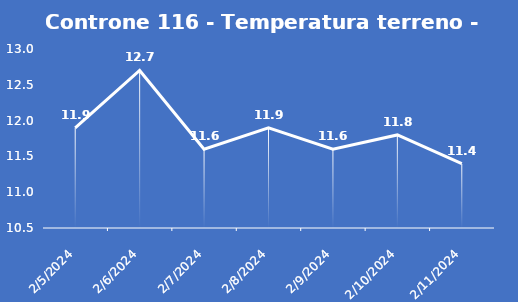
| Category | Controne 116 - Temperatura terreno - Grezzo (°C) |
|---|---|
| 2/5/24 | 11.9 |
| 2/6/24 | 12.7 |
| 2/7/24 | 11.6 |
| 2/8/24 | 11.9 |
| 2/9/24 | 11.6 |
| 2/10/24 | 11.8 |
| 2/11/24 | 11.4 |